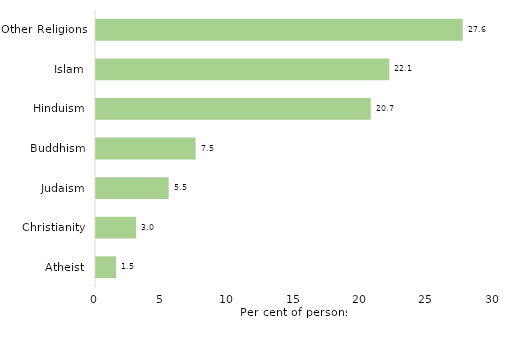
| Category | Series 0 |
|---|---|
| Atheist | 1.51 |
| Christianity | 3.02 |
| Judaism | 5.464 |
| Buddhism | 7.488 |
| Hinduism | 20.656 |
| Islam | 22.053 |
| Other Religions | 27.569 |